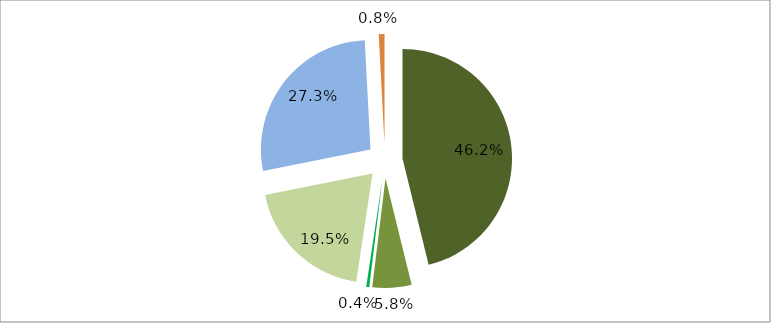
| Category | Series 0 |
|---|---|
| 0 | 0.462 |
| 1 | 0.058 |
| 2 | 0.004 |
| 3 | 0.195 |
| 4 | 0.273 |
| 5 | 0.008 |